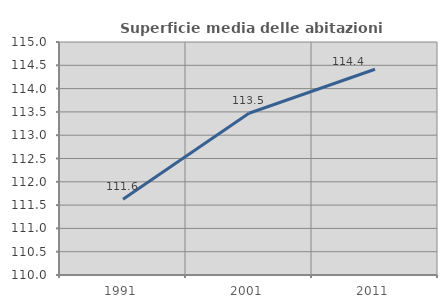
| Category | Superficie media delle abitazioni occupate |
|---|---|
| 1991.0 | 111.623 |
| 2001.0 | 113.471 |
| 2011.0 | 114.416 |